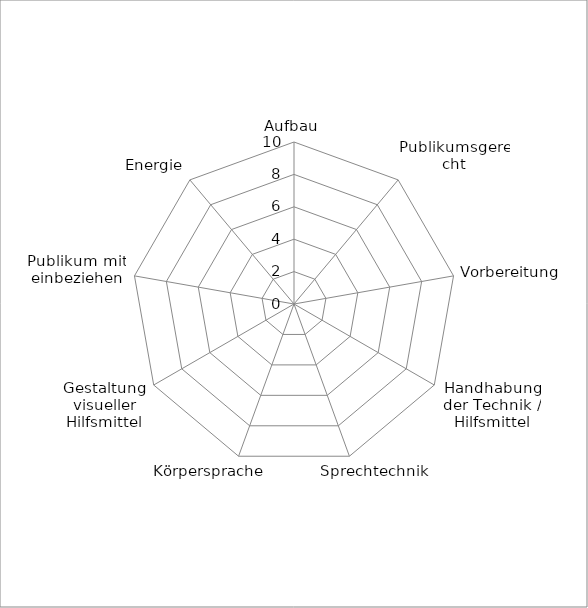
| Category | Series 0 |
|---|---|
| Aufbau | 0 |
| Publikumsgerecht | 0 |
| Vorbereitung | 0 |
| Handhabung der Technik / Hilfsmittel | 0 |
| Sprechtechnik | 0 |
| Körpersprache | 0 |
| Gestaltung visueller Hilfsmittel | 0 |
| Publikum mit einbeziehen | 0 |
| Energie | 0 |